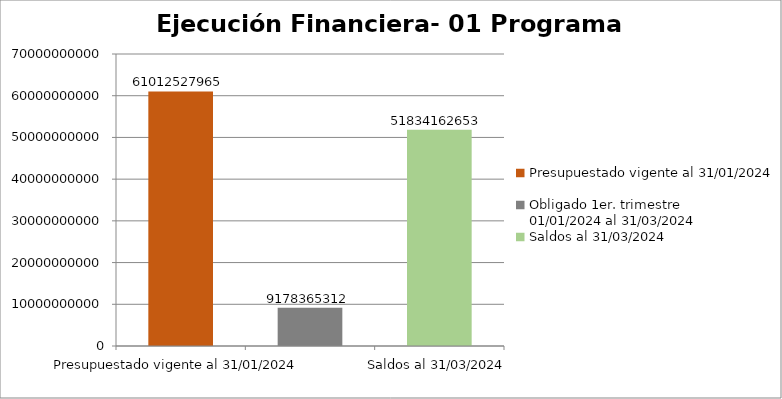
| Category | Presupuestado vigente al 31/01/2024 Obligado 1er. trimestre                      01/01/2024 al 31/03/2024 Saldos al 31/03/2024 |
|---|---|
| Presupuestado vigente al 31/01/2024 | 61012527965 |
| Obligado 1er. trimestre                      01/01/2024 al 31/03/2024 | 9178365312 |
| Saldos al 31/03/2024 | 51834162653 |